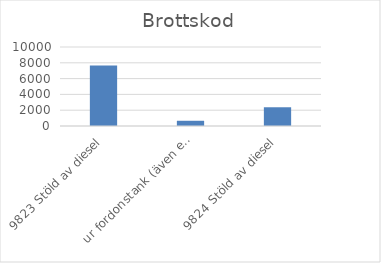
| Category | Summa |
|---|---|
| 9823 Stöld av diesel, ur fordonstank (även entreprenadmaskin m.m.) | 7662 |
| 9824 Stöld av diesel, ur större tankar (ej kopplade till fordon) | 662 |
| 9825 Stöld av drivmedel (även diesel), ej genom smitning | 2372 |